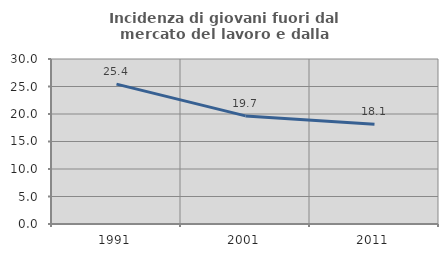
| Category | Incidenza di giovani fuori dal mercato del lavoro e dalla formazione  |
|---|---|
| 1991.0 | 25.434 |
| 2001.0 | 19.653 |
| 2011.0 | 18.125 |